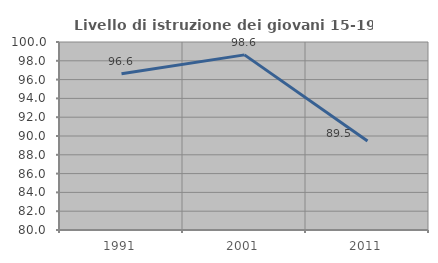
| Category | Livello di istruzione dei giovani 15-19 anni |
|---|---|
| 1991.0 | 96.629 |
| 2001.0 | 98.63 |
| 2011.0 | 89.474 |